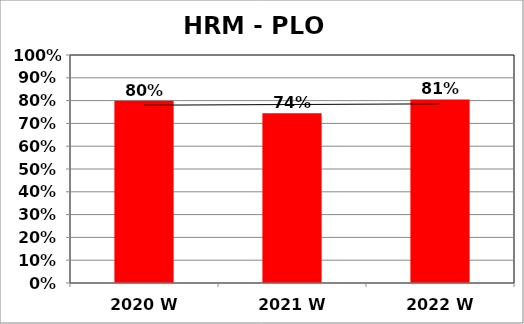
| Category | Series 0 |
|---|---|
| 2020 W | 0.799 |
| 2021 W | 0.744 |
| 2022 W | 0.805 |